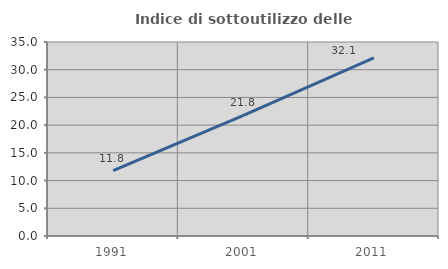
| Category | Indice di sottoutilizzo delle abitazioni  |
|---|---|
| 1991.0 | 11.774 |
| 2001.0 | 21.751 |
| 2011.0 | 32.116 |